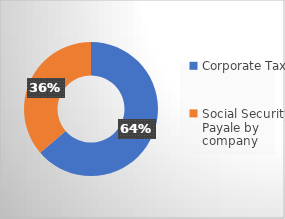
| Category | Total tax paid |
|---|---|
| Corporate Tax | 93495 |
| Social Security Payale by company | 53345 |